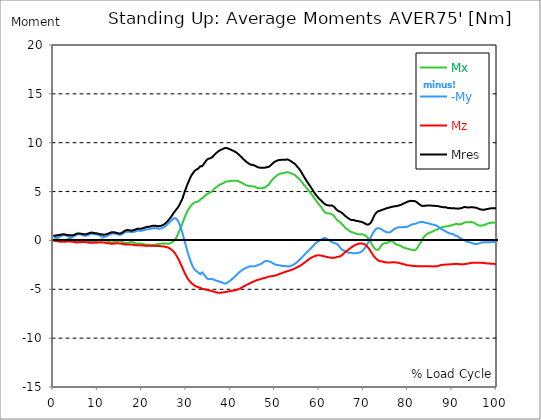
| Category |  Mx |  -My |  Mz |  Mres |
|---|---|---|---|---|
| 0.0 | 0.081 | 0.412 | -0.074 | 0.478 |
| 0.167348456675344 | 0.103 | 0.383 | -0.066 | 0.486 |
| 0.334696913350688 | 0.125 | 0.361 | -0.059 | 0.493 |
| 0.5020453700260321 | 0.132 | 0.338 | -0.066 | 0.508 |
| 0.669393826701376 | 0.132 | 0.316 | -0.066 | 0.515 |
| 0.83674228337672 | 0.14 | 0.309 | -0.074 | 0.515 |
| 1.0040907400520642 | 0.125 | 0.324 | -0.088 | 0.537 |
| 1.1621420602454444 | 0.11 | 0.338 | -0.103 | 0.559 |
| 1.3294905169207885 | 0.088 | 0.361 | -0.118 | 0.567 |
| 1.4968389735961325 | 0.059 | 0.405 | -0.132 | 0.574 |
| 1.6641874302714765 | 0.029 | 0.441 | -0.14 | 0.589 |
| 1.8315358869468206 | 0.007 | 0.478 | -0.147 | 0.603 |
| 1.9988843436221646 | -0.015 | 0.508 | -0.147 | 0.618 |
| 2.1662328002975086 | -0.015 | 0.522 | -0.147 | 0.625 |
| 2.333581256972853 | -0.007 | 0.537 | -0.147 | 0.625 |
| 2.5009297136481967 | 0.015 | 0.53 | -0.14 | 0.618 |
| 2.6682781703235405 | 0.037 | 0.53 | -0.132 | 0.611 |
| 2.8356266269988843 | 0.059 | 0.515 | -0.125 | 0.596 |
| 3.002975083674229 | 0.088 | 0.486 | -0.118 | 0.574 |
| 3.1703235403495724 | 0.118 | 0.456 | -0.11 | 0.559 |
| 3.337671997024917 | 0.14 | 0.405 | -0.11 | 0.544 |
| 3.4957233172182973 | 0.155 | 0.368 | -0.103 | 0.544 |
| 3.663071773893641 | 0.155 | 0.338 | -0.11 | 0.537 |
| 3.8304202305689854 | 0.147 | 0.324 | -0.11 | 0.53 |
| 3.997768687244329 | 0.125 | 0.331 | -0.118 | 0.53 |
| 4.165117143919673 | 0.103 | 0.346 | -0.132 | 0.53 |
| 4.332465600595017 | 0.074 | 0.361 | -0.14 | 0.537 |
| 4.499814057270361 | 0.037 | 0.397 | -0.155 | 0.552 |
| 4.667162513945706 | 0 | 0.434 | -0.169 | 0.567 |
| 4.834510970621049 | -0.044 | 0.478 | -0.177 | 0.603 |
| 5.001859427296393 | -0.081 | 0.53 | -0.191 | 0.633 |
| 5.169207883971737 | -0.103 | 0.559 | -0.199 | 0.67 |
| 5.336556340647081 | -0.118 | 0.596 | -0.206 | 0.699 |
| 5.503904797322425 | -0.125 | 0.618 | -0.206 | 0.714 |
| 5.671253253997769 | -0.118 | 0.633 | -0.199 | 0.721 |
| 5.82930457419115 | -0.096 | 0.625 | -0.199 | 0.714 |
| 5.996653030866494 | -0.074 | 0.618 | -0.191 | 0.706 |
| 6.164001487541838 | -0.052 | 0.603 | -0.184 | 0.692 |
| 6.331349944217181 | -0.022 | 0.589 | -0.177 | 0.677 |
| 6.498698400892526 | 0 | 0.559 | -0.169 | 0.662 |
| 6.66604685756787 | 0.022 | 0.522 | -0.162 | 0.655 |
| 6.833395314243213 | 0.037 | 0.493 | -0.162 | 0.64 |
| 7.000743770918558 | 0.044 | 0.471 | -0.162 | 0.625 |
| 7.168092227593902 | 0.044 | 0.464 | -0.169 | 0.625 |
| 7.335440684269246 | 0.029 | 0.471 | -0.177 | 0.64 |
| 7.50278914094459 | 0 | 0.493 | -0.191 | 0.655 |
| 7.6701375976199335 | -0.037 | 0.522 | -0.206 | 0.677 |
| 7.837486054295278 | -0.074 | 0.552 | -0.213 | 0.699 |
| 7.995537374488658 | -0.103 | 0.589 | -0.228 | 0.728 |
| 8.162885831164003 | -0.132 | 0.633 | -0.235 | 0.758 |
| 8.330234287839346 | -0.155 | 0.662 | -0.243 | 0.787 |
| 8.49758274451469 | -0.155 | 0.684 | -0.243 | 0.802 |
| 8.664931201190035 | -0.14 | 0.692 | -0.243 | 0.802 |
| 8.832279657865378 | -0.125 | 0.692 | -0.235 | 0.802 |
| 8.999628114540721 | -0.103 | 0.677 | -0.228 | 0.78 |
| 9.166976571216066 | -0.074 | 0.655 | -0.221 | 0.758 |
| 9.334325027891412 | -0.059 | 0.633 | -0.221 | 0.736 |
| 9.501673484566755 | -0.074 | 0.633 | -0.228 | 0.736 |
| 9.669021941242098 | -0.074 | 0.633 | -0.228 | 0.736 |
| 9.836370397917442 | -0.044 | 0.618 | -0.221 | 0.714 |
| 10.003718854592787 | -0.022 | 0.596 | -0.213 | 0.699 |
| 10.17106731126813 | 0.007 | 0.567 | -0.213 | 0.677 |
| 10.329118631461512 | 0.037 | 0.537 | -0.206 | 0.655 |
| 10.496467088136853 | 0.066 | 0.493 | -0.199 | 0.64 |
| 10.663815544812199 | 0.088 | 0.449 | -0.191 | 0.633 |
| 10.831164001487544 | 0.088 | 0.419 | -0.199 | 0.618 |
| 10.998512458162887 | 0.096 | 0.39 | -0.199 | 0.603 |
| 11.16586091483823 | 0.096 | 0.368 | -0.199 | 0.596 |
| 11.333209371513574 | 0.088 | 0.361 | -0.206 | 0.589 |
| 11.50055782818892 | 0.066 | 0.361 | -0.221 | 0.589 |
| 11.667906284864264 | 0.037 | 0.383 | -0.235 | 0.596 |
| 11.835254741539607 | 0.007 | 0.412 | -0.25 | 0.618 |
| 12.00260319821495 | -0.022 | 0.441 | -0.265 | 0.64 |
| 12.169951654890292 | -0.059 | 0.478 | -0.28 | 0.662 |
| 12.337300111565641 | -0.103 | 0.522 | -0.294 | 0.684 |
| 12.504648568240984 | -0.147 | 0.567 | -0.309 | 0.721 |
| 12.662699888434362 | -0.177 | 0.611 | -0.316 | 0.758 |
| 12.830048345109708 | -0.191 | 0.64 | -0.324 | 0.787 |
| 12.997396801785053 | -0.206 | 0.67 | -0.331 | 0.817 |
| 13.164745258460396 | -0.206 | 0.692 | -0.331 | 0.839 |
| 13.33209371513574 | -0.206 | 0.699 | -0.331 | 0.846 |
| 13.499442171811083 | -0.191 | 0.706 | -0.331 | 0.846 |
| 13.666790628486426 | -0.169 | 0.699 | -0.324 | 0.839 |
| 13.834139085161771 | -0.147 | 0.692 | -0.316 | 0.824 |
| 14.001487541837117 | -0.125 | 0.684 | -0.309 | 0.802 |
| 14.16883599851246 | -0.096 | 0.67 | -0.302 | 0.787 |
| 14.336184455187803 | -0.081 | 0.647 | -0.294 | 0.765 |
| 14.503532911863147 | -0.066 | 0.625 | -0.294 | 0.743 |
| 14.670881368538492 | -0.059 | 0.596 | -0.294 | 0.721 |
| 14.828932688731873 | -0.059 | 0.574 | -0.302 | 0.714 |
| 14.996281145407215 | -0.066 | 0.567 | -0.309 | 0.706 |
| 15.163629602082558 | -0.081 | 0.574 | -0.316 | 0.721 |
| 15.330978058757903 | -0.103 | 0.603 | -0.331 | 0.751 |
| 15.498326515433247 | -0.132 | 0.64 | -0.353 | 0.787 |
| 15.665674972108594 | -0.177 | 0.692 | -0.368 | 0.839 |
| 15.833023428783937 | -0.213 | 0.743 | -0.383 | 0.905 |
| 16.00037188545928 | -0.243 | 0.795 | -0.397 | 0.957 |
| 16.167720342134626 | -0.258 | 0.831 | -0.405 | 0.993 |
| 16.335068798809967 | -0.265 | 0.861 | -0.412 | 1.023 |
| 16.502417255485312 | -0.272 | 0.883 | -0.412 | 1.045 |
| 16.669765712160658 | -0.265 | 0.898 | -0.412 | 1.06 |
| 16.837114168836 | -0.25 | 0.905 | -0.412 | 1.06 |
| 17.004462625511344 | -0.228 | 0.898 | -0.412 | 1.052 |
| 17.16251394570472 | -0.206 | 0.89 | -0.412 | 1.037 |
| 17.32986240238007 | -0.184 | 0.868 | -0.412 | 1.015 |
| 17.497210859055414 | -0.169 | 0.846 | -0.412 | 0.993 |
| 17.664559315730756 | -0.162 | 0.854 | -0.419 | 1.001 |
| 17.8319077724061 | -0.177 | 0.861 | -0.434 | 1.015 |
| 17.999256229081443 | -0.191 | 0.868 | -0.449 | 1.037 |
| 18.166604685756788 | -0.213 | 0.883 | -0.456 | 1.052 |
| 18.333953142432133 | -0.243 | 0.898 | -0.471 | 1.082 |
| 18.501301599107478 | -0.28 | 0.927 | -0.486 | 1.118 |
| 18.668650055782823 | -0.302 | 0.957 | -0.493 | 1.148 |
| 18.835998512458165 | -0.324 | 0.986 | -0.493 | 1.185 |
| 19.00334696913351 | -0.331 | 1.008 | -0.493 | 1.207 |
| 19.170695425808855 | -0.324 | 1.015 | -0.493 | 1.214 |
| 19.338043882484197 | -0.316 | 1.001 | -0.493 | 1.199 |
| 19.496095202677576 | -0.316 | 1.001 | -0.493 | 1.199 |
| 19.66344365935292 | -0.316 | 0.986 | -0.493 | 1.192 |
| 19.830792116028263 | -0.324 | 0.979 | -0.5 | 1.185 |
| 19.998140572703612 | -0.353 | 1.001 | -0.515 | 1.221 |
| 20.165489029378953 | -0.368 | 1.03 | -0.522 | 1.251 |
| 20.3328374860543 | -0.375 | 1.045 | -0.522 | 1.273 |
| 20.500185942729644 | -0.375 | 1.045 | -0.53 | 1.28 |
| 20.667534399404985 | -0.405 | 1.074 | -0.544 | 1.317 |
| 20.83488285608033 | -0.427 | 1.104 | -0.544 | 1.354 |
| 21.002231312755672 | -0.441 | 1.126 | -0.552 | 1.376 |
| 21.16957976943102 | -0.441 | 1.148 | -0.552 | 1.391 |
| 21.336928226106362 | -0.434 | 1.155 | -0.552 | 1.398 |
| 21.504276682781704 | -0.427 | 1.155 | -0.552 | 1.391 |
| 21.67162513945705 | -0.434 | 1.155 | -0.552 | 1.398 |
| 21.82967645965043 | -0.449 | 1.177 | -0.559 | 1.42 |
| 21.997024916325774 | -0.464 | 1.199 | -0.559 | 1.45 |
| 22.16437337300112 | -0.464 | 1.214 | -0.559 | 1.472 |
| 22.33172182967646 | -0.464 | 1.229 | -0.552 | 1.486 |
| 22.499070286351806 | -0.464 | 1.243 | -0.552 | 1.494 |
| 22.666418743027148 | -0.456 | 1.258 | -0.559 | 1.501 |
| 22.833767199702496 | -0.449 | 1.273 | -0.559 | 1.516 |
| 23.00111565637784 | -0.441 | 1.266 | -0.559 | 1.508 |
| 23.168464113053183 | -0.434 | 1.266 | -0.559 | 1.501 |
| 23.335812569728528 | -0.397 | 1.243 | -0.552 | 1.472 |
| 23.50316102640387 | -0.383 | 1.221 | -0.559 | 1.45 |
| 23.670509483079215 | -0.375 | 1.207 | -0.574 | 1.457 |
| 23.83785793975456 | -0.361 | 1.207 | -0.581 | 1.464 |
| 23.995909259947936 | -0.346 | 1.207 | -0.581 | 1.472 |
| 24.163257716623285 | -0.331 | 1.214 | -0.589 | 1.479 |
| 24.330606173298627 | -0.324 | 1.229 | -0.596 | 1.501 |
| 24.49795462997397 | -0.316 | 1.258 | -0.603 | 1.53 |
| 24.665303086649313 | -0.309 | 1.288 | -0.603 | 1.56 |
| 24.83265154332466 | -0.309 | 1.324 | -0.618 | 1.604 |
| 25.0 | -0.309 | 1.369 | -0.625 | 1.648 |
| 25.167348456675345 | -0.316 | 1.413 | -0.64 | 1.7 |
| 25.334696913350694 | -0.316 | 1.472 | -0.662 | 1.766 |
| 25.502045370026035 | -0.324 | 1.538 | -0.684 | 1.839 |
| 25.669393826701377 | -0.331 | 1.619 | -0.699 | 1.928 |
| 25.836742283376722 | -0.331 | 1.685 | -0.728 | 2.001 |
| 26.004090740052067 | -0.331 | 1.759 | -0.758 | 2.09 |
| 26.17143919672741 | -0.316 | 1.832 | -0.802 | 2.171 |
| 26.329490516920792 | -0.302 | 1.92 | -0.839 | 2.281 |
| 26.49683897359613 | -0.265 | 1.994 | -0.883 | 2.369 |
| 26.66418743027148 | -0.221 | 2.053 | -0.942 | 2.472 |
| 26.831535886946828 | -0.169 | 2.141 | -1.008 | 2.59 |
| 26.998884343622166 | -0.118 | 2.222 | -1.082 | 2.715 |
| 27.166232800297514 | -0.052 | 2.266 | -1.17 | 2.833 |
| 27.333581256972852 | 0.037 | 2.266 | -1.258 | 2.921 |
| 27.5009297136482 | 0.132 | 2.259 | -1.361 | 3.024 |
| 27.668278170323543 | 0.243 | 2.244 | -1.479 | 3.127 |
| 27.835626626998888 | 0.375 | 2.185 | -1.604 | 3.223 |
| 28.002975083674233 | 0.537 | 2.082 | -1.736 | 3.326 |
| 28.170323540349575 | 0.699 | 1.95 | -1.876 | 3.414 |
| 28.33767199702492 | 0.876 | 1.781 | -2.023 | 3.547 |
| 28.50502045370026 | 1.052 | 1.619 | -2.178 | 3.694 |
| 28.663071773893645 | 1.243 | 1.398 | -2.347 | 3.856 |
| 28.830420230568986 | 1.427 | 1.185 | -2.516 | 4.017 |
| 28.99776868724433 | 1.611 | 0.942 | -2.686 | 4.15 |
| 29.165117143919673 | 1.81 | 0.684 | -2.855 | 4.341 |
| 29.33246560059502 | 2.001 | 0.397 | -3.024 | 4.584 |
| 29.499814057270367 | 2.207 | 0.118 | -3.193 | 4.827 |
| 29.66716251394571 | 2.413 | -0.169 | -3.355 | 5.048 |
| 29.834510970621054 | 2.59 | -0.441 | -3.51 | 5.231 |
| 30.00185942729639 | 2.759 | -0.706 | -3.657 | 5.437 |
| 30.169207883971744 | 2.928 | -1.001 | -3.797 | 5.651 |
| 30.33655634064708 | 3.076 | -1.266 | -3.914 | 5.835 |
| 30.50390479732243 | 3.186 | -1.486 | -4.025 | 6.004 |
| 30.671253253997772 | 3.304 | -1.714 | -4.128 | 6.195 |
| 30.829304574191156 | 3.421 | -1.957 | -4.216 | 6.365 |
| 30.996653030866494 | 3.539 | -2.178 | -4.297 | 6.526 |
| 31.164001487541842 | 3.627 | -2.369 | -4.371 | 6.659 |
| 31.331349944217187 | 3.701 | -2.538 | -4.437 | 6.777 |
| 31.498698400892525 | 3.767 | -2.708 | -4.503 | 6.894 |
| 31.666046857567874 | 3.826 | -2.855 | -4.562 | 6.997 |
| 31.833395314243212 | 3.87 | -2.98 | -4.613 | 7.1 |
| 32.00074377091856 | 3.9 | -3.017 | -4.665 | 7.159 |
| 32.1680922275939 | 3.936 | -3.098 | -4.702 | 7.218 |
| 32.33544068426925 | 3.944 | -3.164 | -4.731 | 7.255 |
| 32.50278914094459 | 3.959 | -3.223 | -4.761 | 7.299 |
| 32.670137597619934 | 3.981 | -3.274 | -4.783 | 7.351 |
| 32.83748605429528 | 4.039 | -3.34 | -4.812 | 7.424 |
| 33.004834510970625 | 4.113 | -3.399 | -4.834 | 7.505 |
| 33.162885831164004 | 4.201 | -3.458 | -4.864 | 7.601 |
| 33.33023428783935 | 4.246 | -3.355 | -4.893 | 7.586 |
| 33.497582744514695 | 4.282 | -3.274 | -4.93 | 7.586 |
| 33.664931201190036 | 4.334 | -3.274 | -4.959 | 7.63 |
| 33.83227965786538 | 4.415 | -3.407 | -4.974 | 7.748 |
| 33.99962811454073 | 4.503 | -3.517 | -4.981 | 7.873 |
| 34.16697657121607 | 4.577 | -3.605 | -4.989 | 7.976 |
| 34.33432502789141 | 4.628 | -3.686 | -5.025 | 8.079 |
| 34.50167348456676 | 4.68 | -3.804 | -5.048 | 8.182 |
| 34.6690219412421 | 4.738 | -3.907 | -5.07 | 8.278 |
| 34.83637039791744 | 4.79 | -3.959 | -5.084 | 8.337 |
| 35.00371885459279 | 4.812 | -3.959 | -5.099 | 8.351 |
| 35.17106731126814 | 4.849 | -3.959 | -5.114 | 8.381 |
| 35.338415767943474 | 4.886 | -3.959 | -5.136 | 8.403 |
| 35.49646708813686 | 4.915 | -3.959 | -5.158 | 8.425 |
| 35.6638155448122 | 4.967 | -3.944 | -5.173 | 8.462 |
| 35.831164001487544 | 5.048 | -3.944 | -5.195 | 8.52 |
| 35.998512458162885 | 5.128 | -3.981 | -5.217 | 8.601 |
| 36.165860914838234 | 5.202 | -3.995 | -5.239 | 8.675 |
| 36.333209371513576 | 5.283 | -4.047 | -5.254 | 8.771 |
| 36.50055782818892 | 5.357 | -4.069 | -5.276 | 8.844 |
| 36.667906284864266 | 5.423 | -4.106 | -5.305 | 8.925 |
| 36.83525474153961 | 5.474 | -4.128 | -5.327 | 8.984 |
| 37.002603198214956 | 5.526 | -4.143 | -5.342 | 9.036 |
| 37.1699516548903 | 5.592 | -4.172 | -5.349 | 9.102 |
| 37.337300111565646 | 5.644 | -4.194 | -5.357 | 9.153 |
| 37.50464856824098 | 5.688 | -4.223 | -5.349 | 9.205 |
| 37.66269988843437 | 5.724 | -4.238 | -5.349 | 9.242 |
| 37.83004834510971 | 5.761 | -4.26 | -5.342 | 9.278 |
| 37.99739680178505 | 5.798 | -4.282 | -5.334 | 9.308 |
| 38.16474525846039 | 5.835 | -4.304 | -5.334 | 9.345 |
| 38.33209371513574 | 5.864 | -4.371 | -5.312 | 9.389 |
| 38.49944217181109 | 5.894 | -4.407 | -5.305 | 9.418 |
| 38.666790628486424 | 5.938 | -4.422 | -5.29 | 9.448 |
| 38.83413908516178 | 5.975 | -4.422 | -5.276 | 9.462 |
| 39.001487541837115 | 6.011 | -4.4 | -5.268 | 9.462 |
| 39.16883599851246 | 6.033 | -4.363 | -5.254 | 9.455 |
| 39.336184455187805 | 6.048 | -4.304 | -5.239 | 9.425 |
| 39.503532911863154 | 6.063 | -4.231 | -5.224 | 9.389 |
| 39.670881368538495 | 6.056 | -4.209 | -5.202 | 9.359 |
| 39.83822982521384 | 6.07 | -4.165 | -5.187 | 9.337 |
| 39.996281145407224 | 6.078 | -4.084 | -5.173 | 9.293 |
| 40.163629602082565 | 6.092 | -4.01 | -5.165 | 9.256 |
| 40.33097805875791 | 6.107 | -3.944 | -5.158 | 9.227 |
| 40.498326515433256 | 6.114 | -3.878 | -5.143 | 9.197 |
| 40.6656749721086 | 6.107 | -3.819 | -5.128 | 9.153 |
| 40.83302342878393 | 6.107 | -3.753 | -5.114 | 9.109 |
| 41.00037188545929 | 6.1 | -3.679 | -5.099 | 9.065 |
| 41.16772034213463 | 6.107 | -3.613 | -5.077 | 9.028 |
| 41.33506879880997 | 6.1 | -3.532 | -5.062 | 8.977 |
| 41.50241725548531 | 6.092 | -3.444 | -5.04 | 8.918 |
| 41.66976571216066 | 6.078 | -3.37 | -5.011 | 8.859 |
| 41.837114168836 | 6.041 | -3.296 | -4.974 | 8.785 |
| 42.004462625511344 | 6.004 | -3.23 | -4.937 | 8.704 |
| 42.17181108218669 | 5.96 | -3.179 | -4.908 | 8.638 |
| 42.32986240238007 | 5.923 | -3.134 | -4.871 | 8.565 |
| 42.497210859055414 | 5.886 | -3.098 | -4.834 | 8.498 |
| 42.66455931573076 | 5.85 | -3.017 | -4.79 | 8.41 |
| 42.831907772406105 | 5.813 | -2.965 | -4.746 | 8.337 |
| 42.999256229081446 | 5.776 | -2.914 | -4.694 | 8.263 |
| 43.16660468575679 | 5.732 | -2.884 | -4.665 | 8.197 |
| 43.33395314243214 | 5.688 | -2.84 | -4.621 | 8.123 |
| 43.50130159910748 | 5.658 | -2.796 | -4.577 | 8.057 |
| 43.66865005578282 | 5.629 | -2.759 | -4.532 | 7.991 |
| 43.83599851245817 | 5.599 | -2.745 | -4.496 | 7.939 |
| 44.00334696913351 | 5.577 | -2.715 | -4.459 | 7.895 |
| 44.17069542580886 | 5.57 | -2.678 | -4.429 | 7.851 |
| 44.3380438824842 | 5.541 | -2.649 | -4.385 | 7.799 |
| 44.49609520267758 | 5.526 | -2.641 | -4.349 | 7.755 |
| 44.66344365935292 | 5.541 | -2.641 | -4.312 | 7.741 |
| 44.83079211602827 | 5.555 | -2.664 | -4.275 | 7.741 |
| 44.99814057270361 | 5.548 | -2.664 | -4.238 | 7.718 |
| 45.16548902937895 | 5.548 | -2.634 | -4.201 | 7.696 |
| 45.332837486054295 | 5.518 | -2.634 | -4.172 | 7.667 |
| 45.500185942729644 | 5.482 | -2.627 | -4.143 | 7.638 |
| 45.66753439940499 | 5.46 | -2.619 | -4.106 | 7.608 |
| 45.83488285608033 | 5.423 | -2.597 | -4.076 | 7.564 |
| 46.00223131275568 | 5.379 | -2.546 | -4.054 | 7.512 |
| 46.16957976943102 | 5.349 | -2.502 | -4.039 | 7.476 |
| 46.336928226106366 | 5.342 | -2.487 | -4.017 | 7.461 |
| 46.50427668278171 | 5.342 | -2.465 | -3.995 | 7.454 |
| 46.671625139457056 | 5.334 | -2.421 | -3.973 | 7.439 |
| 46.829676459650436 | 5.342 | -2.391 | -3.944 | 7.439 |
| 46.99702491632577 | 5.349 | -2.369 | -3.914 | 7.439 |
| 47.16437337300112 | 5.357 | -2.31 | -3.892 | 7.431 |
| 47.33172182967646 | 5.364 | -2.244 | -3.87 | 7.431 |
| 47.49907028635181 | 5.379 | -2.193 | -3.856 | 7.431 |
| 47.66641874302716 | 5.408 | -2.141 | -3.841 | 7.439 |
| 47.83376719970249 | 5.452 | -2.104 | -3.819 | 7.461 |
| 48.001115656377834 | 5.504 | -2.097 | -3.797 | 7.476 |
| 48.16846411305319 | 5.563 | -2.09 | -3.775 | 7.49 |
| 48.33581256972853 | 5.621 | -2.097 | -3.753 | 7.512 |
| 48.50316102640387 | 5.695 | -2.126 | -3.723 | 7.512 |
| 48.67050948307921 | 5.769 | -2.163 | -3.686 | 7.535 |
| 48.837857939754564 | 5.879 | -2.185 | -3.679 | 7.608 |
| 49.005206396429905 | 5.997 | -2.2 | -3.679 | 7.696 |
| 49.163257716623285 | 6.078 | -2.244 | -3.664 | 7.748 |
| 49.33060617329863 | 6.166 | -2.281 | -3.65 | 7.814 |
| 49.49795462997397 | 6.254 | -2.318 | -3.642 | 7.888 |
| 49.66530308664932 | 6.343 | -2.369 | -3.627 | 7.969 |
| 49.832651543324666 | 6.423 | -2.421 | -3.613 | 8.027 |
| 50.0 | 6.475 | -2.458 | -3.598 | 8.072 |
| 50.16734845667534 | 6.541 | -2.48 | -3.576 | 8.108 |
| 50.33469691335069 | 6.6 | -2.502 | -3.554 | 8.145 |
| 50.50204537002604 | 6.666 | -2.502 | -3.524 | 8.167 |
| 50.66939382670139 | 6.732 | -2.516 | -3.488 | 8.197 |
| 50.836742283376715 | 6.777 | -2.538 | -3.466 | 8.219 |
| 51.00409074005207 | 6.799 | -2.553 | -3.436 | 8.226 |
| 51.17143919672741 | 6.821 | -2.561 | -3.414 | 8.234 |
| 51.32949051692079 | 6.85 | -2.575 | -3.385 | 8.248 |
| 51.496838973596134 | 6.872 | -2.59 | -3.348 | 8.256 |
| 51.66418743027148 | 6.88 | -2.605 | -3.326 | 8.248 |
| 51.831535886946824 | 6.88 | -2.627 | -3.296 | 8.248 |
| 51.99888434362217 | 6.887 | -2.627 | -3.274 | 8.241 |
| 52.16623280029752 | 6.909 | -2.627 | -3.245 | 8.248 |
| 52.33358125697285 | 6.939 | -2.627 | -3.215 | 8.263 |
| 52.5009297136482 | 6.961 | -2.634 | -3.193 | 8.27 |
| 52.668278170323546 | 6.99 | -2.641 | -3.171 | 8.285 |
| 52.835626626998895 | 7.005 | -2.656 | -3.142 | 8.292 |
| 53.00297508367424 | 6.975 | -2.664 | -3.12 | 8.256 |
| 53.17032354034958 | 6.946 | -2.656 | -3.098 | 8.219 |
| 53.33767199702492 | 6.916 | -2.641 | -3.076 | 8.182 |
| 53.50502045370027 | 6.894 | -2.612 | -3.046 | 8.145 |
| 53.663071773893655 | 6.858 | -2.583 | -3.017 | 8.086 |
| 53.83042023056899 | 6.813 | -2.546 | -2.987 | 8.027 |
| 53.99776868724433 | 6.784 | -2.524 | -2.958 | 7.983 |
| 54.16511714391967 | 6.755 | -2.48 | -2.928 | 7.939 |
| 54.33246560059503 | 6.732 | -2.435 | -2.899 | 7.902 |
| 54.49981405727037 | 6.674 | -2.384 | -2.87 | 7.829 |
| 54.667162513945705 | 6.607 | -2.325 | -2.833 | 7.733 |
| 54.834510970621054 | 6.541 | -2.266 | -2.796 | 7.645 |
| 55.0018594272964 | 6.475 | -2.207 | -2.752 | 7.557 |
| 55.169207883971744 | 6.416 | -2.149 | -2.715 | 7.476 |
| 55.336556340647086 | 6.357 | -2.082 | -2.678 | 7.395 |
| 55.50390479732243 | 6.284 | -2.016 | -2.634 | 7.299 |
| 55.671253253997776 | 6.203 | -1.928 | -2.59 | 7.189 |
| 55.83860171067312 | 6.107 | -1.847 | -2.546 | 7.064 |
| 55.9966530308665 | 6.004 | -1.773 | -2.494 | 6.939 |
| 56.16400148754184 | 5.908 | -1.685 | -2.435 | 6.806 |
| 56.33134994421718 | 5.805 | -1.619 | -2.377 | 6.681 |
| 56.498698400892536 | 5.702 | -1.523 | -2.325 | 6.549 |
| 56.66604685756788 | 5.614 | -1.45 | -2.266 | 6.431 |
| 56.83339531424321 | 5.526 | -1.383 | -2.207 | 6.313 |
| 57.00074377091856 | 5.423 | -1.302 | -2.156 | 6.188 |
| 57.16809222759391 | 5.327 | -1.221 | -2.097 | 6.063 |
| 57.33544068426925 | 5.239 | -1.148 | -2.038 | 5.953 |
| 57.5027891409446 | 5.165 | -1.089 | -1.979 | 5.857 |
| 57.670137597619934 | 5.07 | -1.001 | -1.928 | 5.732 |
| 57.83748605429528 | 4.974 | -0.92 | -1.876 | 5.621 |
| 58.004834510970625 | 4.871 | -0.846 | -1.825 | 5.504 |
| 58.16288583116401 | 4.775 | -0.765 | -1.773 | 5.386 |
| 58.330234287839346 | 4.68 | -0.692 | -1.729 | 5.276 |
| 58.497582744514695 | 4.577 | -0.611 | -1.692 | 5.158 |
| 58.66493120119004 | 4.466 | -0.522 | -1.656 | 5.033 |
| 58.832279657865385 | 4.356 | -0.427 | -1.626 | 4.915 |
| 58.999628114540734 | 4.253 | -0.353 | -1.597 | 4.819 |
| 59.16697657121607 | 4.143 | -0.287 | -1.575 | 4.709 |
| 59.33432502789142 | 4.039 | -0.228 | -1.553 | 4.606 |
| 59.50167348456676 | 3.951 | -0.184 | -1.53 | 4.525 |
| 59.66902194124211 | 3.841 | -0.125 | -1.523 | 4.422 |
| 59.83637039791745 | 3.723 | -0.074 | -1.523 | 4.326 |
| 60.00371885459278 | 3.627 | -0.029 | -1.523 | 4.246 |
| 60.17106731126813 | 3.561 | 0 | -1.53 | 4.194 |
| 60.33841576794349 | 3.466 | 0.059 | -1.545 | 4.12 |
| 60.49646708813685 | 3.363 | 0.11 | -1.56 | 4.039 |
| 60.6638155448122 | 3.252 | 0.155 | -1.575 | 3.966 |
| 60.831164001487544 | 3.134 | 0.199 | -1.597 | 3.878 |
| 60.99851245816289 | 3.024 | 0.235 | -1.611 | 3.804 |
| 61.16586091483824 | 2.928 | 0.258 | -1.633 | 3.745 |
| 61.333209371513576 | 2.84 | 0.243 | -1.656 | 3.686 |
| 61.50055782818892 | 2.796 | 0.199 | -1.67 | 3.635 |
| 61.667906284864266 | 2.781 | 0.155 | -1.685 | 3.62 |
| 61.835254741539615 | 2.774 | 0.125 | -1.707 | 3.613 |
| 62.002603198214956 | 2.759 | 0.096 | -1.714 | 3.591 |
| 62.16995165489029 | 2.752 | 0.044 | -1.729 | 3.583 |
| 62.33730011156564 | 2.745 | -0.015 | -1.744 | 3.576 |
| 62.504648568240995 | 2.737 | -0.081 | -1.759 | 3.576 |
| 62.67199702491633 | 2.722 | -0.132 | -1.773 | 3.583 |
| 62.83004834510971 | 2.671 | -0.169 | -1.781 | 3.561 |
| 62.99739680178505 | 2.627 | -0.199 | -1.788 | 3.539 |
| 63.1647452584604 | 2.568 | -0.221 | -1.788 | 3.495 |
| 63.33209371513575 | 2.494 | -0.258 | -1.781 | 3.444 |
| 63.4994421718111 | 2.399 | -0.272 | -1.773 | 3.37 |
| 63.666790628486424 | 2.288 | -0.294 | -1.736 | 3.267 |
| 63.83413908516177 | 2.185 | -0.324 | -1.707 | 3.179 |
| 64.00148754183712 | 2.09 | -0.368 | -1.678 | 3.105 |
| 64.16883599851248 | 2.031 | -0.419 | -1.663 | 3.054 |
| 64.3361844551878 | 1.987 | -0.508 | -1.663 | 3.009 |
| 64.50353291186315 | 1.935 | -0.603 | -1.656 | 2.98 |
| 64.6708813685385 | 1.869 | -0.706 | -1.633 | 2.943 |
| 64.83822982521384 | 1.795 | -0.809 | -1.589 | 2.906 |
| 65.00557828188919 | 1.722 | -0.898 | -1.538 | 2.862 |
| 65.16362960208257 | 1.648 | -0.957 | -1.479 | 2.803 |
| 65.3309780587579 | 1.575 | -1.001 | -1.42 | 2.73 |
| 65.49832651543326 | 1.494 | -1.03 | -1.354 | 2.649 |
| 65.6656749721086 | 1.398 | -1.06 | -1.273 | 2.583 |
| 65.83302342878395 | 1.31 | -1.074 | -1.207 | 2.516 |
| 66.00037188545929 | 1.236 | -1.082 | -1.148 | 2.45 |
| 66.16772034213463 | 1.177 | -1.126 | -1.089 | 2.391 |
| 66.33506879880998 | 1.133 | -1.207 | -1.023 | 2.332 |
| 66.50241725548531 | 1.074 | -1.243 | -0.964 | 2.281 |
| 66.66976571216065 | 1.015 | -1.266 | -0.905 | 2.229 |
| 66.83711416883601 | 0.957 | -1.273 | -0.846 | 2.178 |
| 67.00446262551135 | 0.905 | -1.258 | -0.795 | 2.126 |
| 67.1718110821867 | 0.861 | -1.266 | -0.736 | 2.097 |
| 67.32986240238007 | 0.854 | -1.288 | -0.677 | 2.082 |
| 67.49721085905541 | 0.839 | -1.31 | -0.618 | 2.09 |
| 67.66455931573076 | 0.802 | -1.31 | -0.581 | 2.09 |
| 67.83190777240611 | 0.765 | -1.31 | -0.537 | 2.068 |
| 67.99925622908145 | 0.758 | -1.31 | -0.493 | 2.053 |
| 68.16660468575678 | 0.721 | -1.302 | -0.456 | 2.023 |
| 68.33395314243214 | 0.677 | -1.288 | -0.419 | 1.994 |
| 68.50130159910749 | 0.655 | -1.295 | -0.39 | 1.987 |
| 68.66865005578282 | 0.655 | -1.288 | -0.361 | 1.987 |
| 68.83599851245816 | 0.625 | -1.273 | -0.338 | 1.957 |
| 69.00334696913352 | 0.625 | -1.258 | -0.324 | 1.95 |
| 69.17069542580886 | 0.618 | -1.229 | -0.309 | 1.935 |
| 69.3380438824842 | 0.618 | -1.192 | -0.302 | 1.92 |
| 69.50539233915956 | 0.625 | -1.148 | -0.302 | 1.898 |
| 69.66344365935292 | 0.625 | -1.089 | -0.316 | 1.876 |
| 69.83079211602826 | 0.611 | -1.023 | -0.324 | 1.832 |
| 69.99814057270362 | 0.596 | -0.927 | -0.353 | 1.803 |
| 70.16548902937896 | 0.567 | -0.839 | -0.383 | 1.773 |
| 70.33283748605429 | 0.522 | -0.743 | -0.427 | 1.729 |
| 70.50018594272964 | 0.464 | -0.618 | -0.486 | 1.678 |
| 70.667534399405 | 0.397 | -0.5 | -0.552 | 1.633 |
| 70.83488285608033 | 0.324 | -0.368 | -0.633 | 1.619 |
| 71.00223131275568 | 0.243 | -0.228 | -0.728 | 1.619 |
| 71.16957976943102 | 0.14 | -0.074 | -0.824 | 1.633 |
| 71.33692822610637 | 0.022 | 0.074 | -0.927 | 1.692 |
| 71.50427668278171 | -0.103 | 0.221 | -1.045 | 1.766 |
| 71.67162513945706 | -0.243 | 0.375 | -1.163 | 1.847 |
| 71.8389735961324 | -0.397 | 0.515 | -1.288 | 1.987 |
| 71.99702491632577 | -0.522 | 0.655 | -1.398 | 2.141 |
| 72.16437337300113 | -0.655 | 0.795 | -1.523 | 2.332 |
| 72.33172182967647 | -0.758 | 0.912 | -1.626 | 2.487 |
| 72.49907028635181 | -0.846 | 1.023 | -1.714 | 2.627 |
| 72.66641874302715 | -0.905 | 1.111 | -1.803 | 2.737 |
| 72.8337671997025 | -0.949 | 1.185 | -1.884 | 2.833 |
| 73.00111565637783 | -0.964 | 1.229 | -1.95 | 2.906 |
| 73.16846411305319 | -0.957 | 1.258 | -2.009 | 2.958 |
| 73.33581256972853 | -0.934 | 1.266 | -2.053 | 2.995 |
| 73.50316102640387 | -0.854 | 1.251 | -2.09 | 3.017 |
| 73.67050948307921 | -0.751 | 1.229 | -2.119 | 3.039 |
| 73.83785793975457 | -0.603 | 1.177 | -2.119 | 3.076 |
| 74.00520639642991 | -0.493 | 1.133 | -2.126 | 3.105 |
| 74.16325771662328 | -0.419 | 1.096 | -2.156 | 3.127 |
| 74.33060617329863 | -0.361 | 1.06 | -2.178 | 3.149 |
| 74.49795462997398 | -0.324 | 1.001 | -2.2 | 3.171 |
| 74.66530308664932 | -0.294 | 0.949 | -2.215 | 3.201 |
| 74.83265154332466 | -0.265 | 0.905 | -2.229 | 3.237 |
| 75.00000000000001 | -0.258 | 0.876 | -2.237 | 3.274 |
| 75.16734845667534 | -0.28 | 0.861 | -2.252 | 3.296 |
| 75.3346969133507 | -0.235 | 0.839 | -2.266 | 3.304 |
| 75.50204537002605 | -0.199 | 0.824 | -2.266 | 3.333 |
| 75.66939382670138 | -0.162 | 0.802 | -2.266 | 3.355 |
| 75.83674228337672 | -0.132 | 0.817 | -2.259 | 3.377 |
| 76.00409074005208 | -0.096 | 0.839 | -2.259 | 3.392 |
| 76.17143919672742 | -0.074 | 0.898 | -2.252 | 3.414 |
| 76.33878765340276 | -0.059 | 0.957 | -2.244 | 3.436 |
| 76.49683897359614 | -0.081 | 1.023 | -2.237 | 3.451 |
| 76.66418743027148 | -0.125 | 1.096 | -2.237 | 3.466 |
| 76.83153588694682 | -0.213 | 1.163 | -2.237 | 3.48 |
| 76.99888434362218 | -0.324 | 1.229 | -2.244 | 3.495 |
| 77.16623280029752 | -0.324 | 1.214 | -2.266 | 3.48 |
| 77.33358125697285 | -0.368 | 1.251 | -2.266 | 3.502 |
| 77.5009297136482 | -0.405 | 1.295 | -2.266 | 3.524 |
| 77.66827817032356 | -0.471 | 1.324 | -2.274 | 3.547 |
| 77.83562662699889 | -0.508 | 1.339 | -2.281 | 3.569 |
| 78.00297508367423 | -0.493 | 1.324 | -2.303 | 3.583 |
| 78.17032354034959 | -0.53 | 1.361 | -2.325 | 3.62 |
| 78.33767199702493 | -0.567 | 1.369 | -2.355 | 3.635 |
| 78.50502045370027 | -0.589 | 1.346 | -2.377 | 3.657 |
| 78.67236891037561 | -0.64 | 1.346 | -2.391 | 3.686 |
| 78.83042023056899 | -0.692 | 1.361 | -2.413 | 3.73 |
| 78.99776868724433 | -0.736 | 1.383 | -2.428 | 3.782 |
| 79.16511714391969 | -0.751 | 1.376 | -2.45 | 3.797 |
| 79.33246560059503 | -0.765 | 1.376 | -2.465 | 3.826 |
| 79.49981405727036 | -0.787 | 1.376 | -2.487 | 3.863 |
| 79.66716251394571 | -0.824 | 1.383 | -2.524 | 3.922 |
| 79.83451097062107 | -0.854 | 1.398 | -2.538 | 3.959 |
| 80.00185942729641 | -0.861 | 1.42 | -2.546 | 3.981 |
| 80.16920788397174 | -0.883 | 1.464 | -2.553 | 4.003 |
| 80.33655634064709 | -0.89 | 1.508 | -2.561 | 4.017 |
| 80.50390479732243 | -0.942 | 1.56 | -2.561 | 4.039 |
| 80.67125325399778 | -0.957 | 1.597 | -2.575 | 4.054 |
| 80.83860171067312 | -0.957 | 1.619 | -2.59 | 4.039 |
| 80.99665303086651 | -0.971 | 1.648 | -2.597 | 4.039 |
| 81.16400148754184 | -1.015 | 1.67 | -2.605 | 4.054 |
| 81.3313499442172 | -1.015 | 1.685 | -2.619 | 4.047 |
| 81.49869840089255 | -1.015 | 1.685 | -2.619 | 4.032 |
| 81.66604685756786 | -0.979 | 1.692 | -2.619 | 3.995 |
| 81.83339531424322 | -0.912 | 1.722 | -2.627 | 3.951 |
| 82.00074377091858 | -0.839 | 1.766 | -2.634 | 3.907 |
| 82.16809222759392 | -0.743 | 1.803 | -2.634 | 3.848 |
| 82.33544068426926 | -0.596 | 1.825 | -2.634 | 3.782 |
| 82.50278914094459 | -0.471 | 1.847 | -2.634 | 3.723 |
| 82.67013759761994 | -0.346 | 1.869 | -2.634 | 3.664 |
| 82.83748605429528 | -0.258 | 1.884 | -2.634 | 3.613 |
| 83.00483451097062 | -0.132 | 1.884 | -2.634 | 3.569 |
| 83.17218296764597 | 0 | 1.876 | -2.627 | 3.532 |
| 83.33023428783935 | 0.147 | 1.884 | -2.634 | 3.524 |
| 83.4975827445147 | 0.302 | 1.884 | -2.641 | 3.547 |
| 83.66493120119004 | 0.383 | 1.862 | -2.634 | 3.547 |
| 83.83227965786537 | 0.464 | 1.817 | -2.634 | 3.554 |
| 83.99962811454073 | 0.544 | 1.788 | -2.634 | 3.554 |
| 84.16697657121607 | 0.618 | 1.773 | -2.634 | 3.569 |
| 84.33432502789142 | 0.67 | 1.766 | -2.634 | 3.576 |
| 84.50167348456677 | 0.721 | 1.766 | -2.634 | 3.583 |
| 84.6690219412421 | 0.751 | 1.744 | -2.641 | 3.583 |
| 84.83637039791745 | 0.78 | 1.722 | -2.649 | 3.576 |
| 85.0037188545928 | 0.817 | 1.692 | -2.649 | 3.569 |
| 85.17106731126813 | 0.846 | 1.67 | -2.649 | 3.569 |
| 85.33841576794349 | 0.883 | 1.641 | -2.656 | 3.561 |
| 85.50576422461883 | 0.905 | 1.633 | -2.656 | 3.554 |
| 85.66381554481221 | 0.934 | 1.619 | -2.656 | 3.547 |
| 85.83116400148755 | 0.971 | 1.597 | -2.649 | 3.547 |
| 85.99851245816289 | 1.008 | 1.582 | -2.641 | 3.539 |
| 86.16586091483823 | 1.037 | 1.56 | -2.649 | 3.539 |
| 86.33320937151358 | 1.06 | 1.538 | -2.649 | 3.532 |
| 86.50055782818893 | 1.096 | 1.501 | -2.641 | 3.524 |
| 86.66790628486427 | 1.14 | 1.442 | -2.634 | 3.517 |
| 86.83525474153961 | 1.185 | 1.391 | -2.619 | 3.502 |
| 87.00260319821496 | 1.229 | 1.346 | -2.583 | 3.488 |
| 87.16995165489031 | 1.266 | 1.302 | -2.546 | 3.458 |
| 87.33730011156564 | 1.28 | 1.251 | -2.531 | 3.444 |
| 87.504648568241 | 1.317 | 1.185 | -2.516 | 3.429 |
| 87.67199702491634 | 1.346 | 1.133 | -2.502 | 3.414 |
| 87.83004834510972 | 1.369 | 1.089 | -2.494 | 3.407 |
| 87.99739680178506 | 1.383 | 1.052 | -2.494 | 3.399 |
| 88.1647452584604 | 1.398 | 1.015 | -2.487 | 3.399 |
| 88.33209371513574 | 1.413 | 0.964 | -2.48 | 3.399 |
| 88.49944217181108 | 1.435 | 0.912 | -2.472 | 3.385 |
| 88.66679062848644 | 1.442 | 0.883 | -2.465 | 3.377 |
| 88.83413908516178 | 1.457 | 0.846 | -2.465 | 3.355 |
| 89.00148754183712 | 1.472 | 0.802 | -2.458 | 3.326 |
| 89.16883599851246 | 1.479 | 0.765 | -2.45 | 3.326 |
| 89.33618445518782 | 1.486 | 0.751 | -2.45 | 3.326 |
| 89.50353291186315 | 1.508 | 0.706 | -2.443 | 3.304 |
| 89.6708813685385 | 1.523 | 0.692 | -2.435 | 3.296 |
| 89.83822982521386 | 1.545 | 0.684 | -2.435 | 3.296 |
| 90.00557828188919 | 1.575 | 0.67 | -2.428 | 3.296 |
| 90.16362960208257 | 1.604 | 0.64 | -2.413 | 3.296 |
| 90.3309780587579 | 1.626 | 0.589 | -2.413 | 3.296 |
| 90.49832651543326 | 1.641 | 0.544 | -2.406 | 3.282 |
| 90.66567497210859 | 1.663 | 0.508 | -2.413 | 3.274 |
| 90.83302342878395 | 1.685 | 0.478 | -2.413 | 3.274 |
| 91.00037188545929 | 1.692 | 0.464 | -2.399 | 3.267 |
| 91.16772034213463 | 1.692 | 0.434 | -2.391 | 3.26 |
| 91.33506879880998 | 1.656 | 0.375 | -2.406 | 3.252 |
| 91.50241725548533 | 1.619 | 0.316 | -2.421 | 3.26 |
| 91.66976571216065 | 1.619 | 0.272 | -2.435 | 3.274 |
| 91.83711416883601 | 1.67 | 0.221 | -2.443 | 3.311 |
| 92.00446262551137 | 1.656 | 0.184 | -2.443 | 3.296 |
| 92.1718110821867 | 1.685 | 0.14 | -2.443 | 3.311 |
| 92.33915953886203 | 1.736 | 0.103 | -2.443 | 3.348 |
| 92.49721085905541 | 1.781 | 0.066 | -2.435 | 3.377 |
| 92.66455931573077 | 1.832 | 0.029 | -2.428 | 3.414 |
| 92.83190777240611 | 1.847 | -0.007 | -2.413 | 3.414 |
| 92.99925622908145 | 1.862 | -0.052 | -2.406 | 3.407 |
| 93.1666046857568 | 1.862 | -0.088 | -2.384 | 3.392 |
| 93.33395314243214 | 1.847 | -0.125 | -2.377 | 3.385 |
| 93.50130159910749 | 1.847 | -0.147 | -2.369 | 3.37 |
| 93.66865005578283 | 1.847 | -0.162 | -2.369 | 3.37 |
| 93.83599851245818 | 1.862 | -0.184 | -2.347 | 3.385 |
| 94.00334696913353 | 1.884 | -0.191 | -2.325 | 3.392 |
| 94.17069542580886 | 1.884 | -0.221 | -2.31 | 3.392 |
| 94.3380438824842 | 1.876 | -0.25 | -2.296 | 3.385 |
| 94.50539233915954 | 1.862 | -0.28 | -2.288 | 3.385 |
| 94.66344365935292 | 1.847 | -0.309 | -2.281 | 3.385 |
| 94.83079211602828 | 1.817 | -0.331 | -2.281 | 3.385 |
| 94.99814057270362 | 1.781 | -0.353 | -2.281 | 3.377 |
| 95.16548902937897 | 1.736 | -0.361 | -2.281 | 3.363 |
| 95.33283748605432 | 1.685 | -0.368 | -2.281 | 3.348 |
| 95.50018594272963 | 1.633 | -0.368 | -2.281 | 3.318 |
| 95.66753439940499 | 1.589 | -0.361 | -2.288 | 3.296 |
| 95.83488285608034 | 1.553 | -0.338 | -2.296 | 3.26 |
| 96.00223131275567 | 1.53 | -0.309 | -2.296 | 3.23 |
| 96.16957976943102 | 1.516 | -0.28 | -2.296 | 3.201 |
| 96.33692822610638 | 1.516 | -0.25 | -2.296 | 3.179 |
| 96.50427668278171 | 1.516 | -0.221 | -2.296 | 3.157 |
| 96.67162513945706 | 1.523 | -0.213 | -2.296 | 3.157 |
| 96.8389735961324 | 1.53 | -0.206 | -2.296 | 3.149 |
| 96.99702491632577 | 1.553 | -0.199 | -2.303 | 3.142 |
| 97.16437337300111 | 1.575 | -0.191 | -2.31 | 3.149 |
| 97.33172182967647 | 1.604 | -0.191 | -2.325 | 3.157 |
| 97.49907028635181 | 1.633 | -0.184 | -2.332 | 3.179 |
| 97.66641874302715 | 1.663 | -0.184 | -2.34 | 3.193 |
| 97.8337671997025 | 1.7 | -0.177 | -2.355 | 3.208 |
| 98.00111565637785 | 1.729 | -0.184 | -2.355 | 3.223 |
| 98.16846411305319 | 1.751 | -0.184 | -2.362 | 3.237 |
| 98.33581256972855 | 1.773 | -0.184 | -2.369 | 3.252 |
| 98.50316102640389 | 1.781 | -0.184 | -2.377 | 3.267 |
| 98.67050948307921 | 1.795 | -0.177 | -2.377 | 3.282 |
| 98.83785793975456 | 1.81 | -0.169 | -2.384 | 3.282 |
| 99.0052063964299 | 1.81 | -0.169 | -2.384 | 3.289 |
| 99.17255485310525 | 1.832 | -0.177 | -2.384 | 3.304 |
| 99.33060617329863 | 1.832 | -0.155 | -2.391 | 3.304 |
| 99.49795462997399 | 1.817 | -0.147 | -2.406 | 3.304 |
| 99.66530308664933 | 1.781 | -0.162 | -2.421 | 3.296 |
| 99.83265154332467 | 1.751 | -0.162 | -2.428 | 3.296 |
| 100.0 | 1.744 | -0.177 | -2.443 | 3.296 |